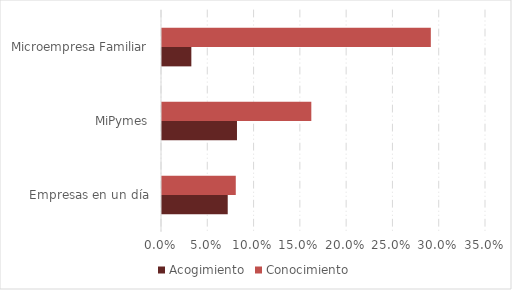
| Category | Acogimiento | Conocimiento |
|---|---|---|
| Empresas en un día | 0.071 | 0.08 |
| MiPymes | 0.081 | 0.161 |
| Microempresa Familiar | 0.032 | 0.29 |